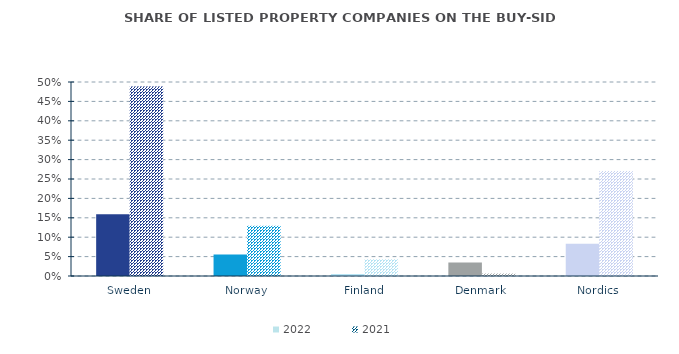
| Category | 2022 | 2021 |
|---|---|---|
| Sweden | 0.159 | 0.489 |
| Norway | 0.056 | 0.129 |
| Finland | 0.005 | 0.043 |
| Denmark | 0.035 | 0.006 |
| Nordics | 0.083 | 0.271 |